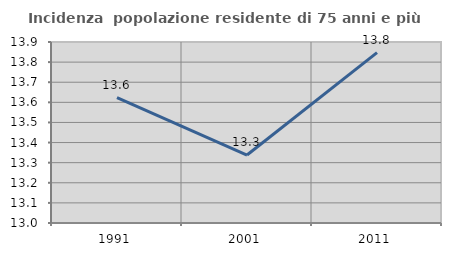
| Category | Incidenza  popolazione residente di 75 anni e più |
|---|---|
| 1991.0 | 13.624 |
| 2001.0 | 13.338 |
| 2011.0 | 13.847 |